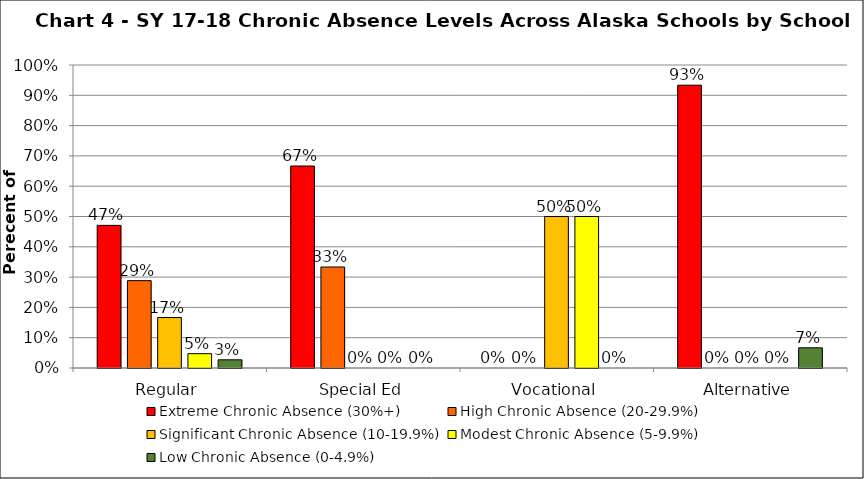
| Category | Extreme Chronic Absence (30%+) | High Chronic Absence (20-29.9%) | Significant Chronic Absence (10-19.9%) | Modest Chronic Absence (5-9.9%) | Low Chronic Absence (0-4.9%) |
|---|---|---|---|---|---|
| 0 | 0.471 | 0.288 | 0.167 | 0.047 | 0.027 |
| 1 | 0.667 | 0.333 | 0 | 0 | 0 |
| 2 | 0 | 0 | 0.5 | 0.5 | 0 |
| 3 | 0.933 | 0 | 0 | 0 | 0.067 |